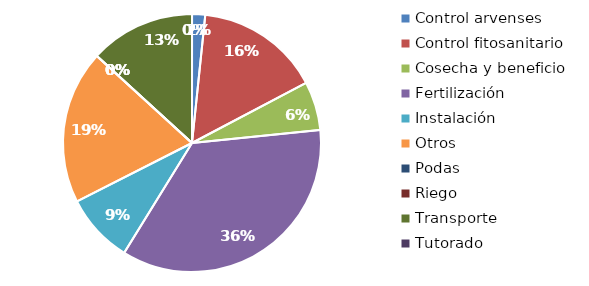
| Category | Valor |
|---|---|
| Control arvenses | 1800000 |
| Control fitosanitario | 17070000 |
| Cosecha y beneficio | 6685000 |
| Fertilización | 38708800 |
| Instalación | 9520000 |
| Otros | 21060000 |
| Podas | 0 |
| Riego | 0 |
| Transporte | 14439000 |
| Tutorado | 0 |